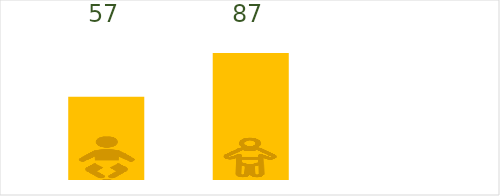
| Category | Status |
|---|---|
| Underweight | 57 |
| Stunting | 87 |